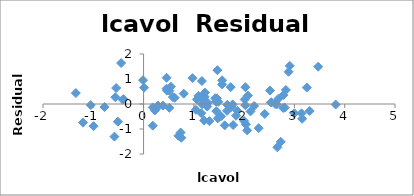
| Category | Series 0 |
|---|---|
| -0.579818495 | -1.305 |
| -0.994252273 | -0.887 |
| -0.510825624 | -0.706 |
| -1.203972804 | -0.747 |
| 0.751416089 | -1.35 |
| -1.049822124 | -0.042 |
| 0.737164066 | -1.141 |
| 0.693147181 | -1.273 |
| -0.776528789 | -0.12 |
| 0.223143551 | -0.259 |
| 0.254642218 | -0.182 |
| -1.347073648 | 0.437 |
| 1.613429934 | -0.853 |
| 1.477048724 | -0.572 |
| 1.205970807 | -0.659 |
| 1.541159072 | -0.491 |
| -0.415515444 | 0.173 |
| 2.288486169 | -0.966 |
| -0.562118918 | 0.27 |
| 0.182321557 | -0.135 |
| 1.147402453 | -0.368 |
| 2.059238834 | -1.055 |
| -0.544727175 | 0.639 |
| 1.781709133 | -0.843 |
| 0.385262401 | -0.064 |
| 1.446918983 | -0.286 |
| 0.512823626 | -0.153 |
| -0.400477567 | 0.194 |
| 1.040276712 | -0.235 |
| 2.409644165 | -0.399 |
| 0.285178942 | -0.06 |
| 0.182321557 | -0.867 |
| 1.2753628 | 0.051 |
| 0.009950331 | 0.653 |
| -0.010050336 | 0.953 |
| 1.30833282 | -0.685 |
| 1.423108334 | 0.232 |
| 0.457424847 | 1.05 |
| 2.660958594 | -1.733 |
| 0.797507196 | 0.414 |
| 0.620576488 | 0.248 |
| 1.442201993 | 0.094 |
| 0.58221562 | 0.277 |
| 1.771556762 | -0.017 |
| 1.486139696 | 0.087 |
| 1.663926098 | -0.033 |
| 2.727852828 | -1.512 |
| 1.16315081 | -0.008 |
| 1.745715531 | -0.117 |
| 1.220829921 | 0.456 |
| 1.091923301 | 0.327 |
| 1.660131027 | -0.273 |
| 0.512823626 | 0.532 |
| 2.12704052 | -0.298 |
| 3.153590358 | -0.592 |
| 1.266947603 | -0.101 |
| 0.97455964 | 1.035 |
| 0.463734016 | 0.535 |
| 0.542324291 | 0.695 |
| 1.061256502 | 0.186 |
| 0.457424847 | 0.615 |
| 1.997417706 | -0.677 |
| 2.77570885 | -0.157 |
| 2.034705648 | -0.812 |
| 2.073171929 | 0.337 |
| 1.458615023 | 0.223 |
| 2.02287119 | -0.048 |
| 2.198335072 | -0.078 |
| -0.446287103 | 1.638 |
| 1.193922468 | 0.172 |
| 1.864080131 | -0.271 |
| 1.160020917 | 0.918 |
| 1.214912744 | 0.29 |
| 1.838961071 | -0.469 |
| 2.999226163 | -0.372 |
| 3.141130476 | -0.371 |
| 2.010894999 | 0.18 |
| 2.537657215 | 0.073 |
| 2.648300197 | -0.017 |
| 2.779440197 | 0.357 |
| 1.467874348 | 1.352 |
| 2.513656063 | 0.538 |
| 2.613006652 | 0.004 |
| 2.677590994 | 0.204 |
| 1.562346305 | 0.946 |
| 3.302849259 | -0.279 |
| 2.024193067 | 0.673 |
| 1.731655545 | 0.675 |
| 2.807593831 | -0.146 |
| 1.562346305 | 0.784 |
| 3.246490992 | 0.657 |
| 2.532902848 | 0.059 |
| 2.830267834 | 0.562 |
| 3.821003607 | -0.021 |
| 2.907447359 | 1.526 |
| 2.882563575 | 1.29 |
| 3.471966453 | 1.491 |